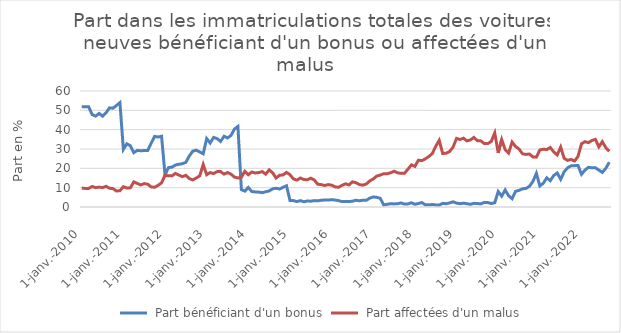
| Category |  Part bénéficiant d'un bonus |  Part affectées d'un malus |
|---|---|---|
| 2010-01-01 | 51.9 | 9.8 |
| 2010-02-01 | 51.8 | 9.6 |
| 2010-03-01 | 51.8 | 9.6 |
| 2010-04-01 | 47.8 | 10.6 |
| 2010-05-01 | 47 | 10 |
| 2010-06-01 | 48.4 | 10.3 |
| 2010-07-01 | 47 | 10 |
| 2010-08-01 | 48.7 | 10.7 |
| 2010-09-01 | 51.3 | 9.7 |
| 2010-10-01 | 51.1 | 9.5 |
| 2010-11-01 | 52.5 | 8.3 |
| 2010-12-01 | 54 | 8.4 |
| 2011-01-01 | 29.8 | 10.5 |
| 2011-02-01 | 32.7 | 9.8 |
| 2011-03-01 | 31.7 | 9.9 |
| 2011-04-01 | 28.1 | 13 |
| 2011-05-01 | 29.3 | 12.2 |
| 2011-06-01 | 29.1 | 11.4 |
| 2011-07-01 | 29.2 | 12.1 |
| 2011-08-01 | 29.2 | 11.8 |
| 2011-09-01 | 33 | 10.4 |
| 2011-10-01 | 36.5 | 10.2 |
| 2011-11-01 | 36.2 | 11.2 |
| 2011-12-01 | 36.6 | 12.5 |
| 2012-01-01 | 16.6 | 16.5 |
| 2012-02-01 | 20.4 | 16.1 |
| 2012-03-01 | 20.6 | 16.1 |
| 2012-04-01 | 21.7 | 17.4 |
| 2012-05-01 | 22.1 | 16.5 |
| 2012-06-01 | 22.4 | 15.7 |
| 2012-07-01 | 23.1 | 16.4 |
| 2012-08-01 | 26.4 | 14.7 |
| 2012-09-01 | 28.9 | 14 |
| 2012-10-01 | 29.4 | 15 |
| 2012-11-01 | 28.5 | 16.1 |
| 2012-12-01 | 27.5 | 22 |
| 2013-01-01 | 35.4 | 16.7 |
| 2013-02-01 | 33.1 | 17.8 |
| 2013-03-01 | 36 | 17.3 |
| 2013-04-01 | 35.4 | 18.3 |
| 2013-05-01 | 33.9 | 18.3 |
| 2013-06-01 | 36.6 | 17 |
| 2013-07-01 | 35.7 | 17.8 |
| 2013-08-01 | 37 | 17 |
| 2013-09-01 | 40.3 | 15.5 |
| 2013-10-01 | 41.7 | 15 |
| 2013-11-01 | 9 | 15.4 |
| 2013-12-01 | 8.2 | 18.5 |
| 2014-01-01 | 10.1 | 16.7 |
| 2014-02-01 | 8 | 18.1 |
| 2014-03-01 | 7.8 | 17.6 |
| 2014-04-01 | 7.7 | 17.8 |
| 2014-05-01 | 7.4 | 18.3 |
| 2014-06-01 | 7.9 | 17 |
| 2014-07-01 | 8.3 | 19.2 |
| 2014-08-01 | 9.4 | 17.7 |
| 2014-09-01 | 9.7 | 15 |
| 2014-10-01 | 9.3 | 16.4 |
| 2014-11-01 | 10.2 | 16.6 |
| 2014-12-01 | 11 | 17.9 |
| 2015-01-01 | 3.4 | 16.7 |
| 2015-02-01 | 3.3 | 14.5 |
| 2015-03-01 | 2.8 | 13.9 |
| 2015-04-01 | 3.3 | 15 |
| 2015-05-01 | 2.7 | 14.2 |
| 2015-06-01 | 3.1 | 14.1 |
| 2015-07-01 | 3 | 14.9 |
| 2015-08-01 | 3.3 | 14 |
| 2015-09-01 | 3.2 | 11.8 |
| 2015-10-01 | 3.5 | 11.6 |
| 2015-11-01 | 3.6 | 11.1 |
| 2015-12-01 | 3.6 | 11.6 |
| 2016-01-01 | 3.8 | 11.3 |
| 2016-02-01 | 3.6 | 10.4 |
| 2016-03-01 | 3.3 | 10.2 |
| 2016-04-01 | 2.8 | 11.2 |
| 2016-05-01 | 2.9 | 12 |
| 2016-06-01 | 2.8 | 11.4 |
| 2016-07-01 | 3 | 13 |
| 2016-08-01 | 3.5 | 12.6 |
| 2016-09-01 | 3.2 | 11.6 |
| 2016-10-01 | 3.5 | 11.3 |
| 2016-11-01 | 3.5 | 11.9 |
| 2016-12-01 | 4.6 | 13.5 |
| 2017-01-01 | 5.2 | 14.5 |
| 2017-02-01 | 5 | 16 |
| 2017-03-01 | 4.5 | 16.5 |
| 2017-04-01 | 1.1 | 17.2 |
| 2017-05-01 | 1.4 | 17.2 |
| 2017-06-01 | 1.7 | 17.7 |
| 2017-07-01 | 1.6 | 18.5 |
| 2017-08-01 | 1.7 | 17.7 |
| 2017-09-01 | 2.1 | 17.4 |
| 2017-10-01 | 1.5 | 17.4 |
| 2017-11-01 | 1.6 | 19.6 |
| 2017-12-01 | 2.2 | 21.8 |
| 2018-01-01 | 1.4 | 21 |
| 2018-02-01 | 1.8 | 24.2 |
| 2018-03-01 | 2.3 | 24 |
| 2018-04-01 | 1.1 | 24.9 |
| 2018-05-01 | 1.1 | 26.1 |
| 2018-06-01 | 1.3 | 27.6 |
| 2018-07-01 | 1.1 | 31.4 |
| 2018-08-01 | 1 | 34.5 |
| 2018-09-01 | 1.9 | 27.7 |
| 2018-10-01 | 1.7 | 27.8 |
| 2018-11-01 | 2.1 | 28.7 |
| 2018-12-01 | 2.7 | 31 |
| 2019-01-01 | 2 | 35.5 |
| 2019-02-01 | 1.7 | 34.9 |
| 2019-03-01 | 2 | 35.6 |
| 2019-04-01 | 1.7 | 34.2 |
| 2019-05-01 | 1.4 | 34.7 |
| 2019-06-01 | 1.9 | 36 |
| 2019-07-01 | 1.8 | 34.3 |
| 2019-08-01 | 1.6 | 34.2 |
| 2019-09-01 | 2.4 | 32.8 |
| 2019-10-01 | 2.3 | 32.8 |
| 2019-11-01 | 1.8 | 33.9 |
| 2019-12-01 | 2.2 | 38.3 |
| 2020-01-01 | 8 | 28 |
| 2020-02-01 | 5.6 | 34.9 |
| 2020-03-01 | 8.8 | 29.7 |
| 2020-04-01 | 5.8 | 27.9 |
| 2020-05-01 | 4.3 | 33.6 |
| 2020-06-01 | 8.1 | 31.3 |
| 2020-07-01 | 8.6 | 30 |
| 2020-08-01 | 9.4 | 27.5 |
| 2020-09-01 | 9.6 | 27.2 |
| 2020-10-01 | 10.7 | 27.4 |
| 2020-11-01 | 13.2 | 25.9 |
| 2020-12-01 | 17.4 | 25.8 |
| 2021-01-01 | 10.9 | 29.5 |
| 2021-02-01 | 12.3 | 29.9 |
| 2021-03-01 | 15.1 | 29.7 |
| 2021-04-01 | 13.6 | 30.8 |
| 2021-05-01 | 16.3 | 28.5 |
| 2021-06-01 | 17.6 | 26.9 |
| 2021-07-01 | 14.3 | 31 |
| 2021-08-01 | 18.2 | 25.2 |
| 2021-09-01 | 20.3 | 24.1 |
| 2021-10-01 | 21.3 | 24.6 |
| 2021-11-01 | 21.4 | 23.8 |
| 2021-12-01 | 21.5 | 26.2 |
| 2022-01-01 | 16.9 | 32.7 |
| 2022-02-01 | 19.1 | 33.8 |
| 2022-03-01 | 20.5 | 33.3 |
| 2022-04-01 | 20.3 | 34.4 |
| 2022-05-01 | 20.3 | 35 |
| 2022-06-01 | 19.1 | 31.1 |
| 2022-07-01 | 17.9 | 33.8 |
| 2022-08-01 | 20 | 30.7 |
| 2022-09-01 | 23.2 | 28.8 |